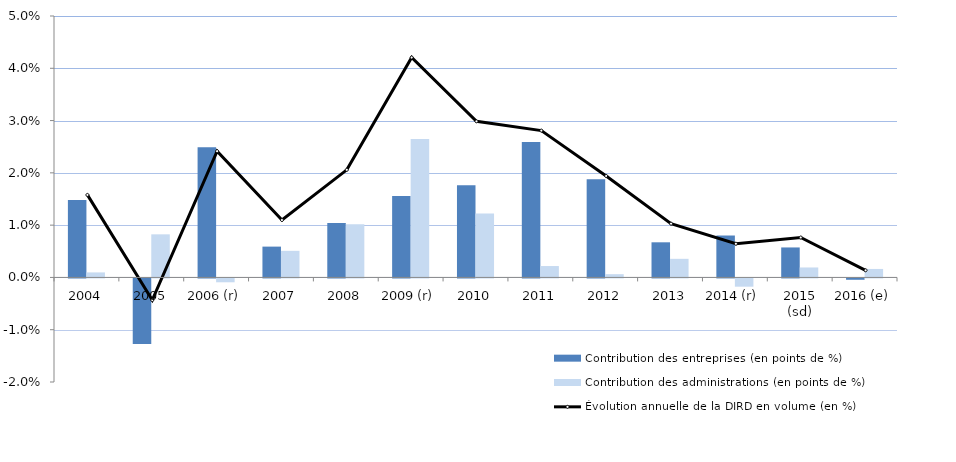
| Category | Contribution des entreprises (en points de %) | Contribution des administrations (en points de %) |
|---|---|---|
| 2004 | 0.015 | 0.001 |
| 2005 | -0.013 | 0.008 |
| 2006 (r) | 0.025 | -0.001 |
| 2007 | 0.006 | 0.005 |
| 2008 | 0.01 | 0.01 |
| 2009 (r) | 0.016 | 0.026 |
| 2010 | 0.018 | 0.012 |
| 2011 | 0.026 | 0.002 |
| 2012 | 0.019 | 0.001 |
| 2013 | 0.007 | 0.004 |
| 2014 (r) | 0.008 | -0.002 |
| 2015 (sd) | 0.006 | 0.002 |
| 2016 (e) | 0 | 0.002 |